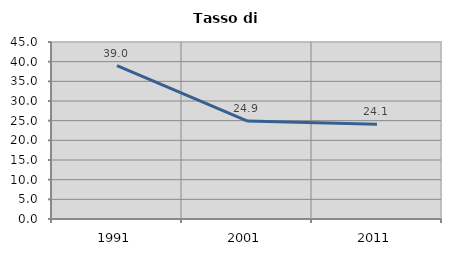
| Category | Tasso di disoccupazione   |
|---|---|
| 1991.0 | 38.977 |
| 2001.0 | 24.919 |
| 2011.0 | 24.067 |